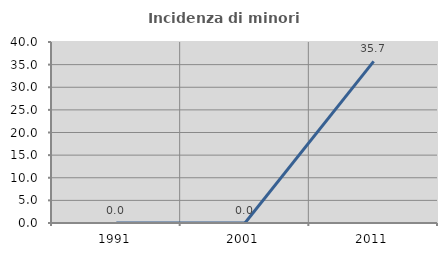
| Category | Incidenza di minori stranieri |
|---|---|
| 1991.0 | 0 |
| 2001.0 | 0 |
| 2011.0 | 35.714 |